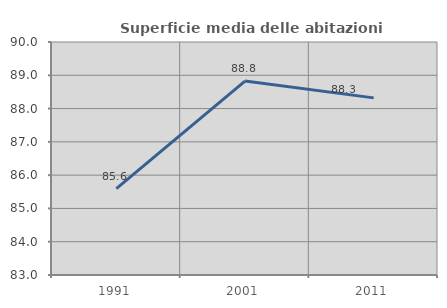
| Category | Superficie media delle abitazioni occupate |
|---|---|
| 1991.0 | 85.595 |
| 2001.0 | 88.826 |
| 2011.0 | 88.322 |